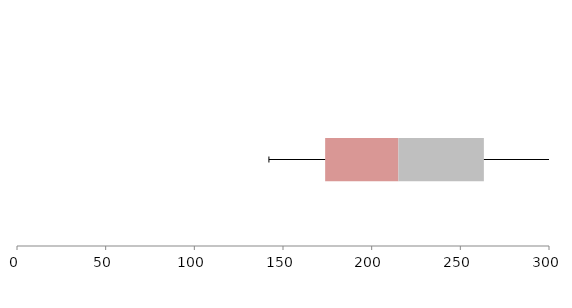
| Category | Series 1 | Series 2 | Series 3 |
|---|---|---|---|
| 0 | 173.773 | 41.311 | 48.194 |